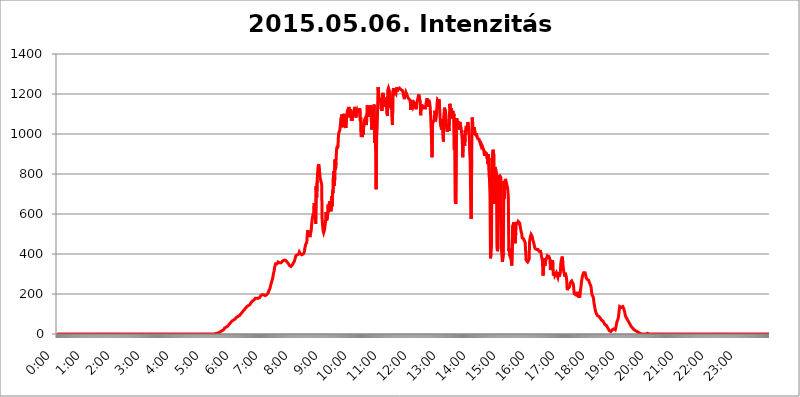
| Category | 2015.05.06. Intenzitás [W/m^2] |
|---|---|
| 0.0 | 0 |
| 0.0006944444444444445 | 0 |
| 0.001388888888888889 | 0 |
| 0.0020833333333333333 | 0 |
| 0.002777777777777778 | 0 |
| 0.003472222222222222 | 0 |
| 0.004166666666666667 | 0 |
| 0.004861111111111111 | 0 |
| 0.005555555555555556 | 0 |
| 0.0062499999999999995 | 0 |
| 0.006944444444444444 | 0 |
| 0.007638888888888889 | 0 |
| 0.008333333333333333 | 0 |
| 0.009027777777777779 | 0 |
| 0.009722222222222222 | 0 |
| 0.010416666666666666 | 0 |
| 0.011111111111111112 | 0 |
| 0.011805555555555555 | 0 |
| 0.012499999999999999 | 0 |
| 0.013194444444444444 | 0 |
| 0.013888888888888888 | 0 |
| 0.014583333333333332 | 0 |
| 0.015277777777777777 | 0 |
| 0.015972222222222224 | 0 |
| 0.016666666666666666 | 0 |
| 0.017361111111111112 | 0 |
| 0.018055555555555557 | 0 |
| 0.01875 | 0 |
| 0.019444444444444445 | 0 |
| 0.02013888888888889 | 0 |
| 0.020833333333333332 | 0 |
| 0.02152777777777778 | 0 |
| 0.022222222222222223 | 0 |
| 0.02291666666666667 | 0 |
| 0.02361111111111111 | 0 |
| 0.024305555555555556 | 0 |
| 0.024999999999999998 | 0 |
| 0.025694444444444447 | 0 |
| 0.02638888888888889 | 0 |
| 0.027083333333333334 | 0 |
| 0.027777777777777776 | 0 |
| 0.02847222222222222 | 0 |
| 0.029166666666666664 | 0 |
| 0.029861111111111113 | 0 |
| 0.030555555555555555 | 0 |
| 0.03125 | 0 |
| 0.03194444444444445 | 0 |
| 0.03263888888888889 | 0 |
| 0.03333333333333333 | 0 |
| 0.034027777777777775 | 0 |
| 0.034722222222222224 | 0 |
| 0.035416666666666666 | 0 |
| 0.036111111111111115 | 0 |
| 0.03680555555555556 | 0 |
| 0.0375 | 0 |
| 0.03819444444444444 | 0 |
| 0.03888888888888889 | 0 |
| 0.03958333333333333 | 0 |
| 0.04027777777777778 | 0 |
| 0.04097222222222222 | 0 |
| 0.041666666666666664 | 0 |
| 0.042361111111111106 | 0 |
| 0.04305555555555556 | 0 |
| 0.043750000000000004 | 0 |
| 0.044444444444444446 | 0 |
| 0.04513888888888889 | 0 |
| 0.04583333333333334 | 0 |
| 0.04652777777777778 | 0 |
| 0.04722222222222222 | 0 |
| 0.04791666666666666 | 0 |
| 0.04861111111111111 | 0 |
| 0.049305555555555554 | 0 |
| 0.049999999999999996 | 0 |
| 0.05069444444444445 | 0 |
| 0.051388888888888894 | 0 |
| 0.052083333333333336 | 0 |
| 0.05277777777777778 | 0 |
| 0.05347222222222222 | 0 |
| 0.05416666666666667 | 0 |
| 0.05486111111111111 | 0 |
| 0.05555555555555555 | 0 |
| 0.05625 | 0 |
| 0.05694444444444444 | 0 |
| 0.057638888888888885 | 0 |
| 0.05833333333333333 | 0 |
| 0.05902777777777778 | 0 |
| 0.059722222222222225 | 0 |
| 0.06041666666666667 | 0 |
| 0.061111111111111116 | 0 |
| 0.06180555555555556 | 0 |
| 0.0625 | 0 |
| 0.06319444444444444 | 0 |
| 0.06388888888888888 | 0 |
| 0.06458333333333334 | 0 |
| 0.06527777777777778 | 0 |
| 0.06597222222222222 | 0 |
| 0.06666666666666667 | 0 |
| 0.06736111111111111 | 0 |
| 0.06805555555555555 | 0 |
| 0.06874999999999999 | 0 |
| 0.06944444444444443 | 0 |
| 0.07013888888888889 | 0 |
| 0.07083333333333333 | 0 |
| 0.07152777777777779 | 0 |
| 0.07222222222222223 | 0 |
| 0.07291666666666667 | 0 |
| 0.07361111111111111 | 0 |
| 0.07430555555555556 | 0 |
| 0.075 | 0 |
| 0.07569444444444444 | 0 |
| 0.0763888888888889 | 0 |
| 0.07708333333333334 | 0 |
| 0.07777777777777778 | 0 |
| 0.07847222222222222 | 0 |
| 0.07916666666666666 | 0 |
| 0.0798611111111111 | 0 |
| 0.08055555555555556 | 0 |
| 0.08125 | 0 |
| 0.08194444444444444 | 0 |
| 0.08263888888888889 | 0 |
| 0.08333333333333333 | 0 |
| 0.08402777777777777 | 0 |
| 0.08472222222222221 | 0 |
| 0.08541666666666665 | 0 |
| 0.08611111111111112 | 0 |
| 0.08680555555555557 | 0 |
| 0.08750000000000001 | 0 |
| 0.08819444444444445 | 0 |
| 0.08888888888888889 | 0 |
| 0.08958333333333333 | 0 |
| 0.09027777777777778 | 0 |
| 0.09097222222222222 | 0 |
| 0.09166666666666667 | 0 |
| 0.09236111111111112 | 0 |
| 0.09305555555555556 | 0 |
| 0.09375 | 0 |
| 0.09444444444444444 | 0 |
| 0.09513888888888888 | 0 |
| 0.09583333333333333 | 0 |
| 0.09652777777777777 | 0 |
| 0.09722222222222222 | 0 |
| 0.09791666666666667 | 0 |
| 0.09861111111111111 | 0 |
| 0.09930555555555555 | 0 |
| 0.09999999999999999 | 0 |
| 0.10069444444444443 | 0 |
| 0.1013888888888889 | 0 |
| 0.10208333333333335 | 0 |
| 0.10277777777777779 | 0 |
| 0.10347222222222223 | 0 |
| 0.10416666666666667 | 0 |
| 0.10486111111111111 | 0 |
| 0.10555555555555556 | 0 |
| 0.10625 | 0 |
| 0.10694444444444444 | 0 |
| 0.1076388888888889 | 0 |
| 0.10833333333333334 | 0 |
| 0.10902777777777778 | 0 |
| 0.10972222222222222 | 0 |
| 0.1111111111111111 | 0 |
| 0.11180555555555556 | 0 |
| 0.11180555555555556 | 0 |
| 0.1125 | 0 |
| 0.11319444444444444 | 0 |
| 0.11388888888888889 | 0 |
| 0.11458333333333333 | 0 |
| 0.11527777777777777 | 0 |
| 0.11597222222222221 | 0 |
| 0.11666666666666665 | 0 |
| 0.1173611111111111 | 0 |
| 0.11805555555555557 | 0 |
| 0.11944444444444445 | 0 |
| 0.12013888888888889 | 0 |
| 0.12083333333333333 | 0 |
| 0.12152777777777778 | 0 |
| 0.12222222222222223 | 0 |
| 0.12291666666666667 | 0 |
| 0.12291666666666667 | 0 |
| 0.12361111111111112 | 0 |
| 0.12430555555555556 | 0 |
| 0.125 | 0 |
| 0.12569444444444444 | 0 |
| 0.12638888888888888 | 0 |
| 0.12708333333333333 | 0 |
| 0.16875 | 0 |
| 0.12847222222222224 | 0 |
| 0.12916666666666668 | 0 |
| 0.12986111111111112 | 0 |
| 0.13055555555555556 | 0 |
| 0.13125 | 0 |
| 0.13194444444444445 | 0 |
| 0.1326388888888889 | 0 |
| 0.13333333333333333 | 0 |
| 0.13402777777777777 | 0 |
| 0.13402777777777777 | 0 |
| 0.13472222222222222 | 0 |
| 0.13541666666666666 | 0 |
| 0.1361111111111111 | 0 |
| 0.13749999999999998 | 0 |
| 0.13819444444444443 | 0 |
| 0.1388888888888889 | 0 |
| 0.13958333333333334 | 0 |
| 0.14027777777777778 | 0 |
| 0.14097222222222222 | 0 |
| 0.14166666666666666 | 0 |
| 0.1423611111111111 | 0 |
| 0.14305555555555557 | 0 |
| 0.14375000000000002 | 0 |
| 0.14444444444444446 | 0 |
| 0.1451388888888889 | 0 |
| 0.1451388888888889 | 0 |
| 0.14652777777777778 | 0 |
| 0.14722222222222223 | 0 |
| 0.14791666666666667 | 0 |
| 0.1486111111111111 | 0 |
| 0.14930555555555555 | 0 |
| 0.15 | 0 |
| 0.15069444444444444 | 0 |
| 0.15138888888888888 | 0 |
| 0.15208333333333332 | 0 |
| 0.15277777777777776 | 0 |
| 0.15347222222222223 | 0 |
| 0.15416666666666667 | 0 |
| 0.15486111111111112 | 0 |
| 0.15555555555555556 | 0 |
| 0.15625 | 0 |
| 0.15694444444444444 | 0 |
| 0.15763888888888888 | 0 |
| 0.15833333333333333 | 0 |
| 0.15902777777777777 | 0 |
| 0.15972222222222224 | 0 |
| 0.16041666666666668 | 0 |
| 0.16111111111111112 | 0 |
| 0.16180555555555556 | 0 |
| 0.1625 | 0 |
| 0.16319444444444445 | 0 |
| 0.1638888888888889 | 0 |
| 0.16458333333333333 | 0 |
| 0.16527777777777777 | 0 |
| 0.16597222222222222 | 0 |
| 0.16666666666666666 | 0 |
| 0.1673611111111111 | 0 |
| 0.16805555555555554 | 0 |
| 0.16874999999999998 | 0 |
| 0.16944444444444443 | 0 |
| 0.17013888888888887 | 0 |
| 0.1708333333333333 | 0 |
| 0.17152777777777775 | 0 |
| 0.17222222222222225 | 0 |
| 0.1729166666666667 | 0 |
| 0.17361111111111113 | 0 |
| 0.17430555555555557 | 0 |
| 0.17500000000000002 | 0 |
| 0.17569444444444446 | 0 |
| 0.1763888888888889 | 0 |
| 0.17708333333333334 | 0 |
| 0.17777777777777778 | 0 |
| 0.17847222222222223 | 0 |
| 0.17916666666666667 | 0 |
| 0.1798611111111111 | 0 |
| 0.18055555555555555 | 0 |
| 0.18125 | 0 |
| 0.18194444444444444 | 0 |
| 0.1826388888888889 | 0 |
| 0.18333333333333335 | 0 |
| 0.1840277777777778 | 0 |
| 0.18472222222222223 | 0 |
| 0.18541666666666667 | 0 |
| 0.18611111111111112 | 0 |
| 0.18680555555555556 | 0 |
| 0.1875 | 0 |
| 0.18819444444444444 | 0 |
| 0.18888888888888888 | 0 |
| 0.18958333333333333 | 0 |
| 0.19027777777777777 | 0 |
| 0.1909722222222222 | 0 |
| 0.19166666666666665 | 0 |
| 0.19236111111111112 | 0 |
| 0.19305555555555554 | 0 |
| 0.19375 | 0 |
| 0.19444444444444445 | 0 |
| 0.1951388888888889 | 0 |
| 0.19583333333333333 | 0 |
| 0.19652777777777777 | 0 |
| 0.19722222222222222 | 0 |
| 0.19791666666666666 | 0 |
| 0.1986111111111111 | 0 |
| 0.19930555555555554 | 0 |
| 0.19999999999999998 | 0 |
| 0.20069444444444443 | 0 |
| 0.20138888888888887 | 0 |
| 0.2020833333333333 | 0 |
| 0.2027777777777778 | 0 |
| 0.2034722222222222 | 0 |
| 0.2041666666666667 | 0 |
| 0.20486111111111113 | 0 |
| 0.20555555555555557 | 0 |
| 0.20625000000000002 | 0 |
| 0.20694444444444446 | 0 |
| 0.2076388888888889 | 0 |
| 0.20833333333333334 | 0 |
| 0.20902777777777778 | 0 |
| 0.20972222222222223 | 0 |
| 0.21041666666666667 | 0 |
| 0.2111111111111111 | 0 |
| 0.21180555555555555 | 0 |
| 0.2125 | 0 |
| 0.21319444444444444 | 0 |
| 0.2138888888888889 | 0 |
| 0.21458333333333335 | 0 |
| 0.2152777777777778 | 0 |
| 0.21597222222222223 | 0 |
| 0.21666666666666667 | 0 |
| 0.21736111111111112 | 0 |
| 0.21805555555555556 | 0 |
| 0.21875 | 0 |
| 0.21944444444444444 | 0 |
| 0.22013888888888888 | 0 |
| 0.22083333333333333 | 0 |
| 0.22152777777777777 | 3.525 |
| 0.2222222222222222 | 3.525 |
| 0.22291666666666665 | 3.525 |
| 0.2236111111111111 | 3.525 |
| 0.22430555555555556 | 3.525 |
| 0.225 | 3.525 |
| 0.22569444444444445 | 7.887 |
| 0.2263888888888889 | 7.887 |
| 0.22708333333333333 | 7.887 |
| 0.22777777777777777 | 12.257 |
| 0.22847222222222222 | 12.257 |
| 0.22916666666666666 | 12.257 |
| 0.2298611111111111 | 12.257 |
| 0.23055555555555554 | 16.636 |
| 0.23124999999999998 | 16.636 |
| 0.23194444444444443 | 21.024 |
| 0.23263888888888887 | 21.024 |
| 0.2333333333333333 | 21.024 |
| 0.2340277777777778 | 25.419 |
| 0.2347222222222222 | 29.823 |
| 0.2354166666666667 | 29.823 |
| 0.23611111111111113 | 29.823 |
| 0.23680555555555557 | 34.234 |
| 0.23750000000000002 | 38.653 |
| 0.23819444444444446 | 38.653 |
| 0.2388888888888889 | 38.653 |
| 0.23958333333333334 | 43.079 |
| 0.24027777777777778 | 43.079 |
| 0.24097222222222223 | 47.511 |
| 0.24166666666666667 | 47.511 |
| 0.2423611111111111 | 51.951 |
| 0.24305555555555555 | 56.398 |
| 0.24375 | 56.398 |
| 0.24444444444444446 | 60.85 |
| 0.24513888888888888 | 65.31 |
| 0.24583333333333335 | 65.31 |
| 0.2465277777777778 | 69.775 |
| 0.24722222222222223 | 69.775 |
| 0.24791666666666667 | 74.246 |
| 0.24861111111111112 | 74.246 |
| 0.24930555555555556 | 74.246 |
| 0.25 | 78.722 |
| 0.25069444444444444 | 78.722 |
| 0.2513888888888889 | 83.205 |
| 0.2520833333333333 | 83.205 |
| 0.25277777777777777 | 83.205 |
| 0.2534722222222222 | 87.692 |
| 0.25416666666666665 | 87.692 |
| 0.2548611111111111 | 92.184 |
| 0.2555555555555556 | 92.184 |
| 0.25625000000000003 | 96.682 |
| 0.2569444444444445 | 96.682 |
| 0.2576388888888889 | 101.184 |
| 0.25833333333333336 | 101.184 |
| 0.2590277777777778 | 105.69 |
| 0.25972222222222224 | 110.201 |
| 0.2604166666666667 | 110.201 |
| 0.2611111111111111 | 114.716 |
| 0.26180555555555557 | 119.235 |
| 0.2625 | 119.235 |
| 0.26319444444444445 | 123.758 |
| 0.2638888888888889 | 128.284 |
| 0.26458333333333334 | 128.284 |
| 0.2652777777777778 | 132.814 |
| 0.2659722222222222 | 137.347 |
| 0.26666666666666666 | 141.884 |
| 0.2673611111111111 | 137.347 |
| 0.26805555555555555 | 141.884 |
| 0.26875 | 141.884 |
| 0.26944444444444443 | 146.423 |
| 0.2701388888888889 | 146.423 |
| 0.2708333333333333 | 150.964 |
| 0.27152777777777776 | 155.509 |
| 0.2722222222222222 | 160.056 |
| 0.27291666666666664 | 160.056 |
| 0.2736111111111111 | 164.605 |
| 0.2743055555555555 | 164.605 |
| 0.27499999999999997 | 169.156 |
| 0.27569444444444446 | 169.156 |
| 0.27638888888888885 | 173.709 |
| 0.27708333333333335 | 173.709 |
| 0.2777777777777778 | 178.264 |
| 0.27847222222222223 | 182.82 |
| 0.2791666666666667 | 182.82 |
| 0.2798611111111111 | 178.264 |
| 0.28055555555555556 | 178.264 |
| 0.28125 | 178.264 |
| 0.28194444444444444 | 178.264 |
| 0.2826388888888889 | 182.82 |
| 0.2833333333333333 | 182.82 |
| 0.28402777777777777 | 182.82 |
| 0.2847222222222222 | 187.378 |
| 0.28541666666666665 | 191.937 |
| 0.28611111111111115 | 196.497 |
| 0.28680555555555554 | 196.497 |
| 0.28750000000000003 | 196.497 |
| 0.2881944444444445 | 196.497 |
| 0.2888888888888889 | 196.497 |
| 0.28958333333333336 | 196.497 |
| 0.2902777777777778 | 191.937 |
| 0.29097222222222224 | 191.937 |
| 0.2916666666666667 | 191.937 |
| 0.2923611111111111 | 191.937 |
| 0.29305555555555557 | 196.497 |
| 0.29375 | 196.497 |
| 0.29444444444444445 | 201.058 |
| 0.2951388888888889 | 201.058 |
| 0.29583333333333334 | 205.62 |
| 0.2965277777777778 | 214.746 |
| 0.2972222222222222 | 219.309 |
| 0.29791666666666666 | 223.873 |
| 0.2986111111111111 | 233 |
| 0.29930555555555555 | 242.127 |
| 0.3 | 251.251 |
| 0.30069444444444443 | 260.373 |
| 0.3013888888888889 | 269.49 |
| 0.3020833333333333 | 278.603 |
| 0.30277777777777776 | 292.259 |
| 0.3034722222222222 | 305.898 |
| 0.30416666666666664 | 314.98 |
| 0.3048611111111111 | 333.113 |
| 0.3055555555555555 | 342.162 |
| 0.30624999999999997 | 351.198 |
| 0.3069444444444444 | 351.198 |
| 0.3076388888888889 | 351.198 |
| 0.30833333333333335 | 351.198 |
| 0.3090277777777778 | 355.712 |
| 0.30972222222222223 | 360.221 |
| 0.3104166666666667 | 360.221 |
| 0.3111111111111111 | 360.221 |
| 0.31180555555555556 | 355.712 |
| 0.3125 | 355.712 |
| 0.31319444444444444 | 355.712 |
| 0.3138888888888889 | 355.712 |
| 0.3145833333333333 | 355.712 |
| 0.31527777777777777 | 360.221 |
| 0.3159722222222222 | 364.728 |
| 0.31666666666666665 | 364.728 |
| 0.31736111111111115 | 364.728 |
| 0.31805555555555554 | 369.23 |
| 0.31875000000000003 | 369.23 |
| 0.3194444444444445 | 369.23 |
| 0.3201388888888889 | 369.23 |
| 0.32083333333333336 | 364.728 |
| 0.3215277777777778 | 364.728 |
| 0.32222222222222224 | 360.221 |
| 0.3229166666666667 | 360.221 |
| 0.3236111111111111 | 355.712 |
| 0.32430555555555557 | 351.198 |
| 0.325 | 346.682 |
| 0.32569444444444445 | 342.162 |
| 0.3263888888888889 | 337.639 |
| 0.32708333333333334 | 337.639 |
| 0.3277777777777778 | 337.639 |
| 0.3284722222222222 | 342.162 |
| 0.32916666666666666 | 342.162 |
| 0.3298611111111111 | 346.682 |
| 0.33055555555555555 | 351.198 |
| 0.33125 | 355.712 |
| 0.33194444444444443 | 360.221 |
| 0.3326388888888889 | 364.728 |
| 0.3333333333333333 | 373.729 |
| 0.3340277777777778 | 382.715 |
| 0.3347222222222222 | 391.685 |
| 0.3354166666666667 | 396.164 |
| 0.3361111111111111 | 396.164 |
| 0.3368055555555556 | 396.164 |
| 0.33749999999999997 | 396.164 |
| 0.33819444444444446 | 400.638 |
| 0.33888888888888885 | 400.638 |
| 0.33958333333333335 | 409.574 |
| 0.34027777777777773 | 405.108 |
| 0.34097222222222223 | 400.638 |
| 0.3416666666666666 | 400.638 |
| 0.3423611111111111 | 396.164 |
| 0.3430555555555555 | 396.164 |
| 0.34375 | 396.164 |
| 0.3444444444444445 | 400.638 |
| 0.3451388888888889 | 400.638 |
| 0.3458333333333334 | 400.638 |
| 0.34652777777777777 | 409.574 |
| 0.34722222222222227 | 427.39 |
| 0.34791666666666665 | 440.702 |
| 0.34861111111111115 | 449.551 |
| 0.34930555555555554 | 445.129 |
| 0.35000000000000003 | 458.38 |
| 0.3506944444444444 | 497.836 |
| 0.3513888888888889 | 519.555 |
| 0.3520833333333333 | 502.192 |
| 0.3527777777777778 | 510.885 |
| 0.3534722222222222 | 506.542 |
| 0.3541666666666667 | 484.735 |
| 0.3548611111111111 | 493.475 |
| 0.35555555555555557 | 506.542 |
| 0.35625 | 519.555 |
| 0.35694444444444445 | 553.986 |
| 0.3576388888888889 | 575.299 |
| 0.35833333333333334 | 588.009 |
| 0.3590277777777778 | 600.661 |
| 0.3597222222222222 | 583.779 |
| 0.36041666666666666 | 654.791 |
| 0.3611111111111111 | 638.256 |
| 0.36180555555555555 | 600.661 |
| 0.3625 | 549.704 |
| 0.36319444444444443 | 739.877 |
| 0.3638888888888889 | 683.473 |
| 0.3645833333333333 | 767.62 |
| 0.3652777777777778 | 814.519 |
| 0.3659722222222222 | 837.682 |
| 0.3666666666666667 | 849.199 |
| 0.3673611111111111 | 845.365 |
| 0.3680555555555556 | 806.757 |
| 0.36874999999999997 | 779.42 |
| 0.36944444444444446 | 783.342 |
| 0.37013888888888885 | 759.723 |
| 0.37083333333333335 | 747.834 |
| 0.37152777777777773 | 571.049 |
| 0.37222222222222223 | 541.121 |
| 0.3729166666666666 | 515.223 |
| 0.3736111111111111 | 506.542 |
| 0.3743055555555555 | 510.885 |
| 0.375 | 523.88 |
| 0.3756944444444445 | 528.2 |
| 0.3763888888888889 | 566.793 |
| 0.3770833333333334 | 609.062 |
| 0.37777777777777777 | 566.793 |
| 0.37847222222222227 | 571.049 |
| 0.37916666666666665 | 588.009 |
| 0.37986111111111115 | 646.537 |
| 0.38055555555555554 | 609.062 |
| 0.38125000000000003 | 646.537 |
| 0.3819444444444444 | 663.019 |
| 0.3826388888888889 | 646.537 |
| 0.3833333333333333 | 650.667 |
| 0.3840277777777778 | 613.252 |
| 0.3847222222222222 | 687.544 |
| 0.3854166666666667 | 638.256 |
| 0.3861111111111111 | 715.858 |
| 0.38680555555555557 | 703.762 |
| 0.3875 | 814.519 |
| 0.38819444444444445 | 747.834 |
| 0.3888888888888889 | 739.877 |
| 0.38958333333333334 | 872.114 |
| 0.3902777777777778 | 822.26 |
| 0.3909722222222222 | 856.855 |
| 0.39166666666666666 | 917.534 |
| 0.3923611111111111 | 936.33 |
| 0.39305555555555555 | 928.819 |
| 0.39375 | 943.832 |
| 0.39444444444444443 | 996.182 |
| 0.3951388888888889 | 1007.383 |
| 0.3958333333333333 | 1014.852 |
| 0.3965277777777778 | 1022.323 |
| 0.3972222222222222 | 1052.255 |
| 0.3979166666666667 | 1078.555 |
| 0.3986111111111111 | 1086.097 |
| 0.3993055555555556 | 1097.437 |
| 0.39999999999999997 | 1041.019 |
| 0.40069444444444446 | 1033.537 |
| 0.40138888888888885 | 1067.267 |
| 0.40208333333333335 | 1101.226 |
| 0.40277777777777773 | 1059.756 |
| 0.40347222222222223 | 1044.762 |
| 0.4041666666666666 | 1044.762 |
| 0.4048611111111111 | 1029.798 |
| 0.4055555555555555 | 1078.555 |
| 0.40625 | 1089.873 |
| 0.4069444444444445 | 1116.426 |
| 0.4076388888888889 | 1112.618 |
| 0.4083333333333334 | 1127.879 |
| 0.40902777777777777 | 1135.543 |
| 0.40972222222222227 | 1120.238 |
| 0.41041666666666665 | 1082.324 |
| 0.41111111111111115 | 1124.056 |
| 0.41180555555555554 | 1105.019 |
| 0.41250000000000003 | 1067.267 |
| 0.4131944444444444 | 1089.873 |
| 0.4138888888888889 | 1067.267 |
| 0.4145833333333333 | 1108.816 |
| 0.4152777777777778 | 1101.226 |
| 0.4159722222222222 | 1116.426 |
| 0.4166666666666667 | 1116.426 |
| 0.4173611111111111 | 1135.543 |
| 0.41805555555555557 | 1120.238 |
| 0.41875 | 1082.324 |
| 0.41944444444444445 | 1093.653 |
| 0.4201388888888889 | 1089.873 |
| 0.42083333333333334 | 1116.426 |
| 0.4215277777777778 | 1108.816 |
| 0.4222222222222222 | 1124.056 |
| 0.42291666666666666 | 1108.816 |
| 0.4236111111111111 | 1105.019 |
| 0.42430555555555555 | 1127.879 |
| 0.425 | 1067.267 |
| 0.42569444444444443 | 1082.324 |
| 0.4263888888888889 | 984.98 |
| 0.4270833333333333 | 992.448 |
| 0.4277777777777778 | 984.98 |
| 0.4284722222222222 | 1007.383 |
| 0.4291666666666667 | 996.182 |
| 0.4298611111111111 | 1044.762 |
| 0.4305555555555556 | 1067.267 |
| 0.43124999999999997 | 1067.267 |
| 0.43194444444444446 | 1078.555 |
| 0.43263888888888885 | 1074.789 |
| 0.43333333333333335 | 1044.762 |
| 0.43402777777777773 | 1063.51 |
| 0.43472222222222223 | 1143.232 |
| 0.4354166666666666 | 1127.879 |
| 0.4361111111111111 | 1112.618 |
| 0.4368055555555555 | 1127.879 |
| 0.4375 | 1086.097 |
| 0.4381944444444445 | 1108.816 |
| 0.4388888888888889 | 1124.056 |
| 0.4395833333333334 | 1143.232 |
| 0.44027777777777777 | 1089.873 |
| 0.44097222222222227 | 1022.323 |
| 0.44166666666666665 | 1044.762 |
| 0.44236111111111115 | 1074.789 |
| 0.44305555555555554 | 1078.555 |
| 0.44375000000000003 | 1078.555 |
| 0.4444444444444444 | 1147.086 |
| 0.4451388888888889 | 955.071 |
| 0.4458333333333333 | 1071.027 |
| 0.4465277777777778 | 925.06 |
| 0.4472222222222222 | 723.889 |
| 0.4479166666666667 | 977.508 |
| 0.4486111111111111 | 1026.06 |
| 0.44930555555555557 | 1127.879 |
| 0.45 | 1233.951 |
| 0.45069444444444445 | 1205.82 |
| 0.4513888888888889 | 1182.099 |
| 0.45208333333333334 | 1182.099 |
| 0.4527777777777778 | 1182.099 |
| 0.4534722222222222 | 1162.571 |
| 0.45416666666666666 | 1124.056 |
| 0.4548611111111111 | 1131.708 |
| 0.45555555555555555 | 1116.426 |
| 0.45625 | 1197.876 |
| 0.45694444444444443 | 1205.82 |
| 0.4576388888888889 | 1186.03 |
| 0.4583333333333333 | 1158.689 |
| 0.4590277777777778 | 1143.232 |
| 0.4597222222222222 | 1135.543 |
| 0.4604166666666667 | 1170.358 |
| 0.4611111111111111 | 1162.571 |
| 0.4618055555555556 | 1182.099 |
| 0.46249999999999997 | 1101.226 |
| 0.46319444444444446 | 1089.873 |
| 0.46388888888888885 | 1221.83 |
| 0.46458333333333335 | 1229.899 |
| 0.46527777777777773 | 1221.83 |
| 0.46597222222222223 | 1209.807 |
| 0.4666666666666666 | 1193.918 |
| 0.4673611111111111 | 1131.708 |
| 0.4680555555555555 | 1178.177 |
| 0.46875 | 1143.232 |
| 0.4694444444444445 | 1074.789 |
| 0.4701388888888889 | 1044.762 |
| 0.4708333333333334 | 1213.804 |
| 0.47152777777777777 | 1229.899 |
| 0.47222222222222227 | 1201.843 |
| 0.47291666666666665 | 1197.876 |
| 0.47361111111111115 | 1209.807 |
| 0.47430555555555554 | 1205.82 |
| 0.47500000000000003 | 1201.843 |
| 0.4756944444444444 | 1225.859 |
| 0.4763888888888889 | 1233.951 |
| 0.4770833333333333 | 1213.804 |
| 0.4777777777777778 | 1225.859 |
| 0.4784722222222222 | 1225.859 |
| 0.4791666666666667 | 1229.899 |
| 0.4798611111111111 | 1229.899 |
| 0.48055555555555557 | 1229.899 |
| 0.48125 | 1229.899 |
| 0.48194444444444445 | 1221.83 |
| 0.4826388888888889 | 1225.859 |
| 0.48333333333333334 | 1217.812 |
| 0.4840277777777778 | 1217.812 |
| 0.4847222222222222 | 1209.807 |
| 0.48541666666666666 | 1205.82 |
| 0.4861111111111111 | 1186.03 |
| 0.48680555555555555 | 1174.263 |
| 0.4875 | 1189.969 |
| 0.48819444444444443 | 1193.918 |
| 0.4888888888888889 | 1209.807 |
| 0.4895833333333333 | 1209.807 |
| 0.4902777777777778 | 1197.876 |
| 0.4909722222222222 | 1189.969 |
| 0.4916666666666667 | 1186.03 |
| 0.4923611111111111 | 1178.177 |
| 0.4930555555555556 | 1182.099 |
| 0.49374999999999997 | 1178.177 |
| 0.49444444444444446 | 1170.358 |
| 0.49513888888888885 | 1162.571 |
| 0.49583333333333335 | 1120.238 |
| 0.49652777777777773 | 1147.086 |
| 0.49722222222222223 | 1139.384 |
| 0.4979166666666666 | 1170.358 |
| 0.4986111111111111 | 1150.946 |
| 0.4993055555555555 | 1135.543 |
| 0.5 | 1131.708 |
| 0.5006944444444444 | 1147.086 |
| 0.5013888888888889 | 1135.543 |
| 0.5020833333333333 | 1158.689 |
| 0.5027777777777778 | 1162.571 |
| 0.5034722222222222 | 1124.056 |
| 0.5041666666666667 | 1154.814 |
| 0.5048611111111111 | 1158.689 |
| 0.5055555555555555 | 1174.263 |
| 0.50625 | 1178.177 |
| 0.5069444444444444 | 1197.876 |
| 0.5076388888888889 | 1201.843 |
| 0.5083333333333333 | 1193.918 |
| 0.5090277777777777 | 1158.689 |
| 0.5097222222222222 | 1093.653 |
| 0.5104166666666666 | 1147.086 |
| 0.5111111111111112 | 1143.232 |
| 0.5118055555555555 | 1150.946 |
| 0.5125000000000001 | 1124.056 |
| 0.5131944444444444 | 1139.384 |
| 0.513888888888889 | 1143.232 |
| 0.5145833333333333 | 1139.384 |
| 0.5152777777777778 | 1135.543 |
| 0.5159722222222222 | 1124.056 |
| 0.5166666666666667 | 1135.543 |
| 0.517361111111111 | 1154.814 |
| 0.5180555555555556 | 1170.358 |
| 0.5187499999999999 | 1178.177 |
| 0.5194444444444445 | 1150.946 |
| 0.5201388888888888 | 1135.543 |
| 0.5208333333333334 | 1170.358 |
| 0.5215277777777778 | 1170.358 |
| 0.5222222222222223 | 1158.689 |
| 0.5229166666666667 | 1139.384 |
| 0.5236111111111111 | 1101.226 |
| 0.5243055555555556 | 1041.019 |
| 0.525 | 958.814 |
| 0.5256944444444445 | 883.516 |
| 0.5263888888888889 | 1052.255 |
| 0.5270833333333333 | 1052.255 |
| 0.5277777777777778 | 1052.255 |
| 0.5284722222222222 | 1071.027 |
| 0.5291666666666667 | 1086.097 |
| 0.5298611111111111 | 1116.426 |
| 0.5305555555555556 | 1063.51 |
| 0.53125 | 1086.097 |
| 0.5319444444444444 | 1093.653 |
| 0.5326388888888889 | 1147.086 |
| 0.5333333333333333 | 1170.358 |
| 0.5340277777777778 | 1166.46 |
| 0.5347222222222222 | 1162.571 |
| 0.5354166666666667 | 1174.263 |
| 0.5361111111111111 | 1135.543 |
| 0.5368055555555555 | 1093.653 |
| 0.5375 | 1044.762 |
| 0.5381944444444444 | 1037.277 |
| 0.5388888888888889 | 1022.323 |
| 0.5395833333333333 | 1074.789 |
| 0.5402777777777777 | 1059.756 |
| 0.5409722222222222 | 981.244 |
| 0.5416666666666666 | 962.555 |
| 0.5423611111111112 | 1093.653 |
| 0.5430555555555555 | 1131.708 |
| 0.5437500000000001 | 1131.708 |
| 0.5444444444444444 | 1112.618 |
| 0.545138888888889 | 1093.653 |
| 0.5458333333333333 | 1044.762 |
| 0.5465277777777778 | 1022.323 |
| 0.5472222222222222 | 1011.118 |
| 0.5479166666666667 | 1007.383 |
| 0.548611111111111 | 1041.019 |
| 0.5493055555555556 | 1014.852 |
| 0.5499999999999999 | 1078.555 |
| 0.5506944444444445 | 1150.946 |
| 0.5513888888888888 | 1147.086 |
| 0.5520833333333334 | 1082.324 |
| 0.5527777777777778 | 1127.879 |
| 0.5534722222222223 | 1078.555 |
| 0.5541666666666667 | 1101.226 |
| 0.5548611111111111 | 1116.426 |
| 0.5555555555555556 | 1074.789 |
| 0.55625 | 1101.226 |
| 0.5569444444444445 | 921.298 |
| 0.5576388888888889 | 1078.555 |
| 0.5583333333333333 | 658.909 |
| 0.5590277777777778 | 650.667 |
| 0.5597222222222222 | 1014.852 |
| 0.5604166666666667 | 1078.555 |
| 0.5611111111111111 | 1044.762 |
| 0.5618055555555556 | 1048.508 |
| 0.5625 | 1063.51 |
| 0.5631944444444444 | 1022.323 |
| 0.5638888888888889 | 1026.06 |
| 0.5645833333333333 | 1059.756 |
| 0.5652777777777778 | 1056.004 |
| 0.5659722222222222 | 1037.277 |
| 0.5666666666666667 | 1022.323 |
| 0.5673611111111111 | 999.916 |
| 0.5680555555555555 | 966.295 |
| 0.56875 | 883.516 |
| 0.5694444444444444 | 992.448 |
| 0.5701388888888889 | 966.295 |
| 0.5708333333333333 | 966.295 |
| 0.5715277777777777 | 940.082 |
| 0.5722222222222222 | 1018.587 |
| 0.5729166666666666 | 996.182 |
| 0.5736111111111112 | 1041.019 |
| 0.5743055555555555 | 1033.537 |
| 0.5750000000000001 | 1022.323 |
| 0.5756944444444444 | 1059.756 |
| 0.576388888888889 | 1059.756 |
| 0.5770833333333333 | 1029.798 |
| 0.5777777777777778 | 992.448 |
| 0.5784722222222222 | 909.996 |
| 0.5791666666666667 | 864.493 |
| 0.579861111111111 | 667.123 |
| 0.5805555555555556 | 575.299 |
| 0.5812499999999999 | 868.305 |
| 0.5819444444444445 | 1082.324 |
| 0.5826388888888888 | 1056.004 |
| 0.5833333333333334 | 1014.852 |
| 0.5840277777777778 | 996.182 |
| 0.5847222222222223 | 1033.537 |
| 0.5854166666666667 | 1022.323 |
| 0.5861111111111111 | 1018.587 |
| 0.5868055555555556 | 992.448 |
| 0.5875 | 1003.65 |
| 0.5881944444444445 | 1003.65 |
| 0.5888888888888889 | 984.98 |
| 0.5895833333333333 | 977.508 |
| 0.5902777777777778 | 973.772 |
| 0.5909722222222222 | 973.772 |
| 0.5916666666666667 | 973.772 |
| 0.5923611111111111 | 962.555 |
| 0.5930555555555556 | 955.071 |
| 0.59375 | 955.071 |
| 0.5944444444444444 | 940.082 |
| 0.5951388888888889 | 947.58 |
| 0.5958333333333333 | 943.832 |
| 0.5965277777777778 | 936.33 |
| 0.5972222222222222 | 932.576 |
| 0.5979166666666667 | 921.298 |
| 0.5986111111111111 | 921.298 |
| 0.5993055555555555 | 891.099 |
| 0.6 | 909.996 |
| 0.6006944444444444 | 909.996 |
| 0.6013888888888889 | 906.223 |
| 0.6020833333333333 | 902.447 |
| 0.6027777777777777 | 875.918 |
| 0.6034722222222222 | 883.516 |
| 0.6041666666666666 | 849.199 |
| 0.6048611111111112 | 898.668 |
| 0.6055555555555555 | 902.447 |
| 0.6062500000000001 | 767.62 |
| 0.6069444444444444 | 695.666 |
| 0.607638888888889 | 378.224 |
| 0.6083333333333333 | 400.638 |
| 0.6090277777777778 | 440.702 |
| 0.6097222222222222 | 879.719 |
| 0.6104166666666667 | 860.676 |
| 0.611111111111111 | 921.298 |
| 0.6118055555555556 | 917.534 |
| 0.6124999999999999 | 891.099 |
| 0.6131944444444445 | 650.667 |
| 0.6138888888888888 | 833.834 |
| 0.6145833333333334 | 829.981 |
| 0.6152777777777778 | 818.392 |
| 0.6159722222222223 | 806.757 |
| 0.6166666666666667 | 436.27 |
| 0.6173611111111111 | 414.035 |
| 0.6180555555555556 | 431.833 |
| 0.61875 | 787.258 |
| 0.6194444444444445 | 787.258 |
| 0.6201388888888889 | 783.342 |
| 0.6208333333333333 | 791.169 |
| 0.6215277777777778 | 791.169 |
| 0.6222222222222222 | 783.342 |
| 0.6229166666666667 | 431.833 |
| 0.6236111111111111 | 396.164 |
| 0.6243055555555556 | 360.221 |
| 0.625 | 360.221 |
| 0.6256944444444444 | 405.108 |
| 0.6263888888888889 | 763.674 |
| 0.6270833333333333 | 675.311 |
| 0.6277777777777778 | 759.723 |
| 0.6284722222222222 | 775.492 |
| 0.6291666666666667 | 767.62 |
| 0.6298611111111111 | 759.723 |
| 0.6305555555555555 | 747.834 |
| 0.63125 | 735.89 |
| 0.6319444444444444 | 719.877 |
| 0.6326388888888889 | 683.473 |
| 0.6333333333333333 | 414.035 |
| 0.6340277777777777 | 427.39 |
| 0.6347222222222222 | 391.685 |
| 0.6354166666666666 | 391.685 |
| 0.6361111111111112 | 378.224 |
| 0.6368055555555555 | 364.728 |
| 0.6375000000000001 | 342.162 |
| 0.6381944444444444 | 342.162 |
| 0.638888888888889 | 541.121 |
| 0.6395833333333333 | 545.416 |
| 0.6402777777777778 | 558.261 |
| 0.6409722222222222 | 562.53 |
| 0.6416666666666667 | 562.53 |
| 0.642361111111111 | 453.968 |
| 0.6430555555555556 | 506.542 |
| 0.6437499999999999 | 553.986 |
| 0.6444444444444445 | 549.704 |
| 0.6451388888888888 | 553.986 |
| 0.6458333333333334 | 553.986 |
| 0.6465277777777778 | 562.53 |
| 0.6472222222222223 | 562.53 |
| 0.6479166666666667 | 558.261 |
| 0.6486111111111111 | 553.986 |
| 0.6493055555555556 | 536.82 |
| 0.65 | 523.88 |
| 0.6506944444444445 | 510.885 |
| 0.6513888888888889 | 502.192 |
| 0.6520833333333333 | 480.356 |
| 0.6527777777777778 | 484.735 |
| 0.6534722222222222 | 480.356 |
| 0.6541666666666667 | 475.972 |
| 0.6548611111111111 | 467.187 |
| 0.6555555555555556 | 462.786 |
| 0.65625 | 458.38 |
| 0.6569444444444444 | 458.38 |
| 0.6576388888888889 | 369.23 |
| 0.6583333333333333 | 369.23 |
| 0.6590277777777778 | 364.728 |
| 0.6597222222222222 | 360.221 |
| 0.6604166666666667 | 355.712 |
| 0.6611111111111111 | 360.221 |
| 0.6618055555555555 | 373.729 |
| 0.6625 | 462.786 |
| 0.6631944444444444 | 480.356 |
| 0.6638888888888889 | 484.735 |
| 0.6645833333333333 | 497.836 |
| 0.6652777777777777 | 497.836 |
| 0.6659722222222222 | 489.108 |
| 0.6666666666666666 | 475.972 |
| 0.6673611111111111 | 467.187 |
| 0.6680555555555556 | 458.38 |
| 0.6687500000000001 | 449.551 |
| 0.6694444444444444 | 436.27 |
| 0.6701388888888888 | 427.39 |
| 0.6708333333333334 | 431.833 |
| 0.6715277777777778 | 427.39 |
| 0.6722222222222222 | 422.943 |
| 0.6729166666666666 | 422.943 |
| 0.6736111111111112 | 422.943 |
| 0.6743055555555556 | 422.943 |
| 0.6749999999999999 | 418.492 |
| 0.6756944444444444 | 414.035 |
| 0.6763888888888889 | 414.035 |
| 0.6770833333333334 | 418.492 |
| 0.6777777777777777 | 414.035 |
| 0.6784722222222223 | 405.108 |
| 0.6791666666666667 | 387.202 |
| 0.6798611111111111 | 378.224 |
| 0.6805555555555555 | 360.221 |
| 0.68125 | 292.259 |
| 0.6819444444444445 | 310.44 |
| 0.6826388888888889 | 378.224 |
| 0.6833333333333332 | 382.715 |
| 0.6840277777777778 | 342.162 |
| 0.6847222222222222 | 360.221 |
| 0.6854166666666667 | 360.221 |
| 0.686111111111111 | 378.224 |
| 0.6868055555555556 | 382.715 |
| 0.6875 | 391.685 |
| 0.6881944444444444 | 391.685 |
| 0.688888888888889 | 387.202 |
| 0.6895833333333333 | 387.202 |
| 0.6902777777777778 | 382.715 |
| 0.6909722222222222 | 373.729 |
| 0.6916666666666668 | 319.517 |
| 0.6923611111111111 | 319.517 |
| 0.6930555555555555 | 351.198 |
| 0.69375 | 360.221 |
| 0.6944444444444445 | 369.23 |
| 0.6951388888888889 | 355.712 |
| 0.6958333333333333 | 292.259 |
| 0.6965277777777777 | 301.354 |
| 0.6972222222222223 | 310.44 |
| 0.6979166666666666 | 292.259 |
| 0.6986111111111111 | 292.259 |
| 0.6993055555555556 | 296.808 |
| 0.7000000000000001 | 305.898 |
| 0.7006944444444444 | 296.808 |
| 0.7013888888888888 | 296.808 |
| 0.7020833333333334 | 283.156 |
| 0.7027777777777778 | 278.603 |
| 0.7034722222222222 | 310.44 |
| 0.7041666666666666 | 287.709 |
| 0.7048611111111112 | 296.808 |
| 0.7055555555555556 | 305.898 |
| 0.7062499999999999 | 351.198 |
| 0.7069444444444444 | 369.23 |
| 0.7076388888888889 | 378.224 |
| 0.7083333333333334 | 387.202 |
| 0.7090277777777777 | 355.712 |
| 0.7097222222222223 | 333.113 |
| 0.7104166666666667 | 310.44 |
| 0.7111111111111111 | 301.354 |
| 0.7118055555555555 | 287.709 |
| 0.7125 | 305.898 |
| 0.7131944444444445 | 296.808 |
| 0.7138888888888889 | 287.709 |
| 0.7145833333333332 | 264.932 |
| 0.7152777777777778 | 219.309 |
| 0.7159722222222222 | 228.436 |
| 0.7166666666666667 | 233 |
| 0.717361111111111 | 228.436 |
| 0.7180555555555556 | 233 |
| 0.71875 | 242.127 |
| 0.7194444444444444 | 255.813 |
| 0.720138888888889 | 260.373 |
| 0.7208333333333333 | 260.373 |
| 0.7215277777777778 | 264.932 |
| 0.7222222222222222 | 269.49 |
| 0.7229166666666668 | 264.932 |
| 0.7236111111111111 | 251.251 |
| 0.7243055555555555 | 233 |
| 0.725 | 201.058 |
| 0.7256944444444445 | 205.62 |
| 0.7263888888888889 | 201.058 |
| 0.7270833333333333 | 196.497 |
| 0.7277777777777777 | 210.182 |
| 0.7284722222222223 | 191.937 |
| 0.7291666666666666 | 210.182 |
| 0.7298611111111111 | 205.62 |
| 0.7305555555555556 | 191.937 |
| 0.7312500000000001 | 182.82 |
| 0.7319444444444444 | 196.497 |
| 0.7326388888888888 | 182.82 |
| 0.7333333333333334 | 210.182 |
| 0.7340277777777778 | 223.873 |
| 0.7347222222222222 | 242.127 |
| 0.7354166666666666 | 264.932 |
| 0.7361111111111112 | 278.603 |
| 0.7368055555555556 | 292.259 |
| 0.7374999999999999 | 296.808 |
| 0.7381944444444444 | 305.898 |
| 0.7388888888888889 | 310.44 |
| 0.7395833333333334 | 310.44 |
| 0.7402777777777777 | 305.898 |
| 0.7409722222222223 | 296.808 |
| 0.7416666666666667 | 283.156 |
| 0.7423611111111111 | 278.603 |
| 0.7430555555555555 | 274.047 |
| 0.74375 | 269.49 |
| 0.7444444444444445 | 269.49 |
| 0.7451388888888889 | 269.49 |
| 0.7458333333333332 | 264.932 |
| 0.7465277777777778 | 255.813 |
| 0.7472222222222222 | 251.251 |
| 0.7479166666666667 | 251.251 |
| 0.748611111111111 | 237.564 |
| 0.7493055555555556 | 214.746 |
| 0.75 | 196.497 |
| 0.7506944444444444 | 191.937 |
| 0.751388888888889 | 187.378 |
| 0.7520833333333333 | 178.264 |
| 0.7527777777777778 | 155.509 |
| 0.7534722222222222 | 141.884 |
| 0.7541666666666668 | 128.284 |
| 0.7548611111111111 | 114.716 |
| 0.7555555555555555 | 110.201 |
| 0.75625 | 101.184 |
| 0.7569444444444445 | 96.682 |
| 0.7576388888888889 | 92.184 |
| 0.7583333333333333 | 87.692 |
| 0.7590277777777777 | 87.692 |
| 0.7597222222222223 | 87.692 |
| 0.7604166666666666 | 87.692 |
| 0.7611111111111111 | 87.692 |
| 0.7618055555555556 | 78.722 |
| 0.7625000000000001 | 74.246 |
| 0.7631944444444444 | 69.775 |
| 0.7638888888888888 | 69.775 |
| 0.7645833333333334 | 65.31 |
| 0.7652777777777778 | 65.31 |
| 0.7659722222222222 | 65.31 |
| 0.7666666666666666 | 56.398 |
| 0.7673611111111112 | 51.951 |
| 0.7680555555555556 | 47.511 |
| 0.7687499999999999 | 47.511 |
| 0.7694444444444444 | 47.511 |
| 0.7701388888888889 | 43.079 |
| 0.7708333333333334 | 38.653 |
| 0.7715277777777777 | 34.234 |
| 0.7722222222222223 | 29.823 |
| 0.7729166666666667 | 25.419 |
| 0.7736111111111111 | 21.024 |
| 0.7743055555555555 | 16.636 |
| 0.775 | 12.257 |
| 0.7756944444444445 | 12.257 |
| 0.7763888888888889 | 12.257 |
| 0.7770833333333332 | 12.257 |
| 0.7777777777777778 | 16.636 |
| 0.7784722222222222 | 21.024 |
| 0.7791666666666667 | 25.419 |
| 0.779861111111111 | 25.419 |
| 0.7805555555555556 | 25.419 |
| 0.78125 | 21.024 |
| 0.7819444444444444 | 21.024 |
| 0.782638888888889 | 21.024 |
| 0.7833333333333333 | 29.823 |
| 0.7840277777777778 | 43.079 |
| 0.7847222222222222 | 56.398 |
| 0.7854166666666668 | 65.31 |
| 0.7861111111111111 | 65.31 |
| 0.7868055555555555 | 78.722 |
| 0.7875 | 96.682 |
| 0.7881944444444445 | 119.235 |
| 0.7888888888888889 | 137.347 |
| 0.7895833333333333 | 137.347 |
| 0.7902777777777777 | 132.814 |
| 0.7909722222222223 | 132.814 |
| 0.7916666666666666 | 137.347 |
| 0.7923611111111111 | 137.347 |
| 0.7930555555555556 | 137.347 |
| 0.7937500000000001 | 132.814 |
| 0.7944444444444444 | 128.284 |
| 0.7951388888888888 | 119.235 |
| 0.7958333333333334 | 110.201 |
| 0.7965277777777778 | 96.682 |
| 0.7972222222222222 | 87.692 |
| 0.7979166666666666 | 83.205 |
| 0.7986111111111112 | 78.722 |
| 0.7993055555555556 | 74.246 |
| 0.7999999999999999 | 69.775 |
| 0.8006944444444444 | 65.31 |
| 0.8013888888888889 | 60.85 |
| 0.8020833333333334 | 56.398 |
| 0.8027777777777777 | 56.398 |
| 0.8034722222222223 | 47.511 |
| 0.8041666666666667 | 47.511 |
| 0.8048611111111111 | 38.653 |
| 0.8055555555555555 | 38.653 |
| 0.80625 | 34.234 |
| 0.8069444444444445 | 29.823 |
| 0.8076388888888889 | 29.823 |
| 0.8083333333333332 | 25.419 |
| 0.8090277777777778 | 21.024 |
| 0.8097222222222222 | 21.024 |
| 0.8104166666666667 | 16.636 |
| 0.811111111111111 | 16.636 |
| 0.8118055555555556 | 12.257 |
| 0.8125 | 12.257 |
| 0.8131944444444444 | 12.257 |
| 0.813888888888889 | 7.887 |
| 0.8145833333333333 | 7.887 |
| 0.8152777777777778 | 7.887 |
| 0.8159722222222222 | 3.525 |
| 0.8166666666666668 | 3.525 |
| 0.8173611111111111 | 3.525 |
| 0.8180555555555555 | 0 |
| 0.81875 | 0 |
| 0.8194444444444445 | 0 |
| 0.8201388888888889 | 0 |
| 0.8208333333333333 | 0 |
| 0.8215277777777777 | 0 |
| 0.8222222222222223 | 0 |
| 0.8229166666666666 | 0 |
| 0.8236111111111111 | 0 |
| 0.8243055555555556 | 0 |
| 0.8250000000000001 | 0 |
| 0.8256944444444444 | 0 |
| 0.8263888888888888 | 3.525 |
| 0.8270833333333334 | 3.525 |
| 0.8277777777777778 | 3.525 |
| 0.8284722222222222 | 0 |
| 0.8291666666666666 | 0 |
| 0.8298611111111112 | 0 |
| 0.8305555555555556 | 0 |
| 0.8312499999999999 | 0 |
| 0.8319444444444444 | 0 |
| 0.8326388888888889 | 0 |
| 0.8333333333333334 | 0 |
| 0.8340277777777777 | 0 |
| 0.8347222222222223 | 0 |
| 0.8354166666666667 | 0 |
| 0.8361111111111111 | 0 |
| 0.8368055555555555 | 0 |
| 0.8375 | 0 |
| 0.8381944444444445 | 0 |
| 0.8388888888888889 | 0 |
| 0.8395833333333332 | 0 |
| 0.8402777777777778 | 0 |
| 0.8409722222222222 | 0 |
| 0.8416666666666667 | 0 |
| 0.842361111111111 | 0 |
| 0.8430555555555556 | 0 |
| 0.84375 | 0 |
| 0.8444444444444444 | 0 |
| 0.845138888888889 | 0 |
| 0.8458333333333333 | 0 |
| 0.8465277777777778 | 0 |
| 0.8472222222222222 | 0 |
| 0.8479166666666668 | 0 |
| 0.8486111111111111 | 0 |
| 0.8493055555555555 | 0 |
| 0.85 | 0 |
| 0.8506944444444445 | 0 |
| 0.8513888888888889 | 0 |
| 0.8520833333333333 | 0 |
| 0.8527777777777777 | 0 |
| 0.8534722222222223 | 0 |
| 0.8541666666666666 | 0 |
| 0.8548611111111111 | 0 |
| 0.8555555555555556 | 0 |
| 0.8562500000000001 | 0 |
| 0.8569444444444444 | 0 |
| 0.8576388888888888 | 0 |
| 0.8583333333333334 | 0 |
| 0.8590277777777778 | 0 |
| 0.8597222222222222 | 0 |
| 0.8604166666666666 | 0 |
| 0.8611111111111112 | 0 |
| 0.8618055555555556 | 0 |
| 0.8624999999999999 | 0 |
| 0.8631944444444444 | 0 |
| 0.8638888888888889 | 0 |
| 0.8645833333333334 | 0 |
| 0.8652777777777777 | 0 |
| 0.8659722222222223 | 0 |
| 0.8666666666666667 | 0 |
| 0.8673611111111111 | 0 |
| 0.8680555555555555 | 0 |
| 0.86875 | 0 |
| 0.8694444444444445 | 0 |
| 0.8701388888888889 | 0 |
| 0.8708333333333332 | 0 |
| 0.8715277777777778 | 0 |
| 0.8722222222222222 | 0 |
| 0.8729166666666667 | 0 |
| 0.873611111111111 | 0 |
| 0.8743055555555556 | 0 |
| 0.875 | 0 |
| 0.8756944444444444 | 0 |
| 0.876388888888889 | 0 |
| 0.8770833333333333 | 0 |
| 0.8777777777777778 | 0 |
| 0.8784722222222222 | 0 |
| 0.8791666666666668 | 0 |
| 0.8798611111111111 | 0 |
| 0.8805555555555555 | 0 |
| 0.88125 | 0 |
| 0.8819444444444445 | 0 |
| 0.8826388888888889 | 0 |
| 0.8833333333333333 | 0 |
| 0.8840277777777777 | 0 |
| 0.8847222222222223 | 0 |
| 0.8854166666666666 | 0 |
| 0.8861111111111111 | 0 |
| 0.8868055555555556 | 0 |
| 0.8875000000000001 | 0 |
| 0.8881944444444444 | 0 |
| 0.8888888888888888 | 0 |
| 0.8895833333333334 | 0 |
| 0.8902777777777778 | 0 |
| 0.8909722222222222 | 0 |
| 0.8916666666666666 | 0 |
| 0.8923611111111112 | 0 |
| 0.8930555555555556 | 0 |
| 0.8937499999999999 | 0 |
| 0.8944444444444444 | 0 |
| 0.8951388888888889 | 0 |
| 0.8958333333333334 | 0 |
| 0.8965277777777777 | 0 |
| 0.8972222222222223 | 0 |
| 0.8979166666666667 | 0 |
| 0.8986111111111111 | 0 |
| 0.8993055555555555 | 0 |
| 0.9 | 0 |
| 0.9006944444444445 | 0 |
| 0.9013888888888889 | 0 |
| 0.9020833333333332 | 0 |
| 0.9027777777777778 | 0 |
| 0.9034722222222222 | 0 |
| 0.9041666666666667 | 0 |
| 0.904861111111111 | 0 |
| 0.9055555555555556 | 0 |
| 0.90625 | 0 |
| 0.9069444444444444 | 0 |
| 0.907638888888889 | 0 |
| 0.9083333333333333 | 0 |
| 0.9090277777777778 | 0 |
| 0.9097222222222222 | 0 |
| 0.9104166666666668 | 0 |
| 0.9111111111111111 | 0 |
| 0.9118055555555555 | 0 |
| 0.9125 | 0 |
| 0.9131944444444445 | 0 |
| 0.9138888888888889 | 0 |
| 0.9145833333333333 | 0 |
| 0.9152777777777777 | 0 |
| 0.9159722222222223 | 0 |
| 0.9166666666666666 | 0 |
| 0.9173611111111111 | 0 |
| 0.9180555555555556 | 0 |
| 0.9187500000000001 | 0 |
| 0.9194444444444444 | 0 |
| 0.9201388888888888 | 0 |
| 0.9208333333333334 | 0 |
| 0.9215277777777778 | 0 |
| 0.9222222222222222 | 0 |
| 0.9229166666666666 | 0 |
| 0.9236111111111112 | 0 |
| 0.9243055555555556 | 0 |
| 0.9249999999999999 | 0 |
| 0.9256944444444444 | 0 |
| 0.9263888888888889 | 0 |
| 0.9270833333333334 | 0 |
| 0.9277777777777777 | 0 |
| 0.9284722222222223 | 0 |
| 0.9291666666666667 | 0 |
| 0.9298611111111111 | 0 |
| 0.9305555555555555 | 0 |
| 0.93125 | 0 |
| 0.9319444444444445 | 0 |
| 0.9326388888888889 | 0 |
| 0.9333333333333332 | 0 |
| 0.9340277777777778 | 0 |
| 0.9347222222222222 | 0 |
| 0.9354166666666667 | 0 |
| 0.936111111111111 | 0 |
| 0.9368055555555556 | 0 |
| 0.9375 | 0 |
| 0.9381944444444444 | 0 |
| 0.938888888888889 | 0 |
| 0.9395833333333333 | 0 |
| 0.9402777777777778 | 0 |
| 0.9409722222222222 | 0 |
| 0.9416666666666668 | 0 |
| 0.9423611111111111 | 0 |
| 0.9430555555555555 | 0 |
| 0.94375 | 0 |
| 0.9444444444444445 | 0 |
| 0.9451388888888889 | 0 |
| 0.9458333333333333 | 0 |
| 0.9465277777777777 | 0 |
| 0.9472222222222223 | 0 |
| 0.9479166666666666 | 0 |
| 0.9486111111111111 | 0 |
| 0.9493055555555556 | 0 |
| 0.9500000000000001 | 0 |
| 0.9506944444444444 | 0 |
| 0.9513888888888888 | 0 |
| 0.9520833333333334 | 0 |
| 0.9527777777777778 | 0 |
| 0.9534722222222222 | 0 |
| 0.9541666666666666 | 0 |
| 0.9548611111111112 | 0 |
| 0.9555555555555556 | 0 |
| 0.9562499999999999 | 0 |
| 0.9569444444444444 | 0 |
| 0.9576388888888889 | 0 |
| 0.9583333333333334 | 0 |
| 0.9590277777777777 | 0 |
| 0.9597222222222223 | 0 |
| 0.9604166666666667 | 0 |
| 0.9611111111111111 | 0 |
| 0.9618055555555555 | 0 |
| 0.9625 | 0 |
| 0.9631944444444445 | 0 |
| 0.9638888888888889 | 0 |
| 0.9645833333333332 | 0 |
| 0.9652777777777778 | 0 |
| 0.9659722222222222 | 0 |
| 0.9666666666666667 | 0 |
| 0.967361111111111 | 0 |
| 0.9680555555555556 | 0 |
| 0.96875 | 0 |
| 0.9694444444444444 | 0 |
| 0.970138888888889 | 0 |
| 0.9708333333333333 | 0 |
| 0.9715277777777778 | 0 |
| 0.9722222222222222 | 0 |
| 0.9729166666666668 | 0 |
| 0.9736111111111111 | 0 |
| 0.9743055555555555 | 0 |
| 0.975 | 0 |
| 0.9756944444444445 | 0 |
| 0.9763888888888889 | 0 |
| 0.9770833333333333 | 0 |
| 0.9777777777777777 | 0 |
| 0.9784722222222223 | 0 |
| 0.9791666666666666 | 0 |
| 0.9798611111111111 | 0 |
| 0.9805555555555556 | 0 |
| 0.9812500000000001 | 0 |
| 0.9819444444444444 | 0 |
| 0.9826388888888888 | 0 |
| 0.9833333333333334 | 0 |
| 0.9840277777777778 | 0 |
| 0.9847222222222222 | 0 |
| 0.9854166666666666 | 0 |
| 0.9861111111111112 | 0 |
| 0.9868055555555556 | 0 |
| 0.9874999999999999 | 0 |
| 0.9881944444444444 | 0 |
| 0.9888888888888889 | 0 |
| 0.9895833333333334 | 0 |
| 0.9902777777777777 | 0 |
| 0.9909722222222223 | 0 |
| 0.9916666666666667 | 0 |
| 0.9923611111111111 | 0 |
| 0.9930555555555555 | 0 |
| 0.99375 | 0 |
| 0.9944444444444445 | 0 |
| 0.9951388888888889 | 0 |
| 0.9958333333333332 | 0 |
| 0.9965277777777778 | 0 |
| 0.9972222222222222 | 0 |
| 0.9979166666666667 | 0 |
| 0.998611111111111 | 0 |
| 0.9993055555555556 | 0 |